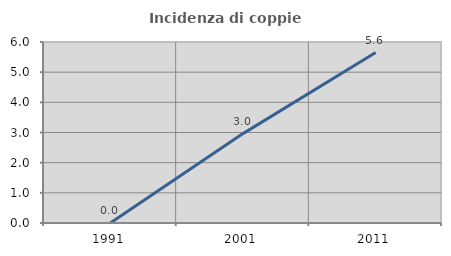
| Category | Incidenza di coppie miste |
|---|---|
| 1991.0 | 0 |
| 2001.0 | 2.963 |
| 2011.0 | 5.65 |